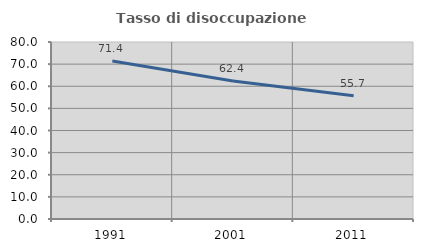
| Category | Tasso di disoccupazione giovanile  |
|---|---|
| 1991.0 | 71.437 |
| 2001.0 | 62.403 |
| 2011.0 | 55.723 |